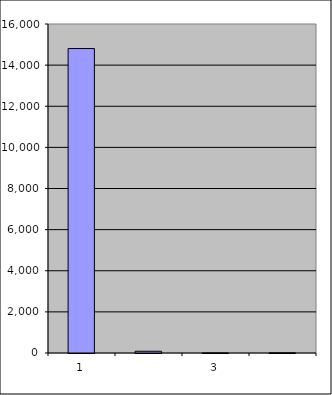
| Category | Series 0 |
|---|---|
| 0 | 14806.25 |
| 1 | 84.753 |
| 2 | 3.168 |
| 3 | 9.669 |